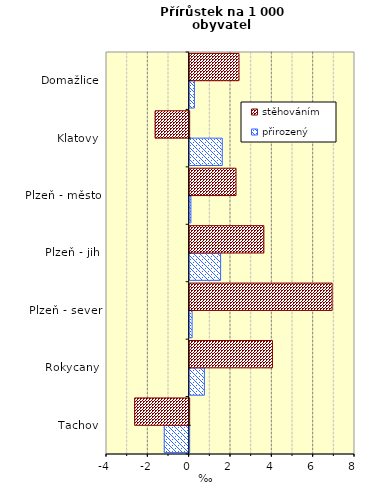
| Category | přirozený | stěhováním |
|---|---|---|
| Tachov | -1.204 | -2.635 |
| Rokycany | 0.713 | 4.006 |
| Plzeň - sever | 0.119 | 6.893 |
| Plzeň - jih | 1.497 | 3.59 |
| Plzeň - město | 0.059 | 2.243 |
| Klatovy | 1.578 | -1.647 |
| Domažlice | 0.23 | 2.386 |